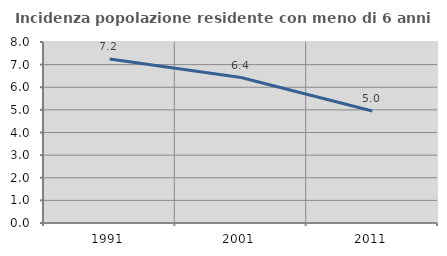
| Category | Incidenza popolazione residente con meno di 6 anni |
|---|---|
| 1991.0 | 7.244 |
| 2001.0 | 6.429 |
| 2011.0 | 4.951 |